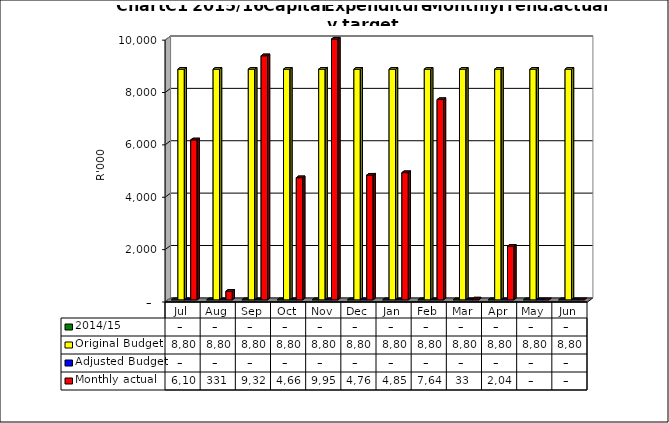
| Category | 2014/15 | Original Budget | Adjusted Budget | Monthly actual |
|---|---|---|---|---|
| Jul | 0 | 8808585.26 | 0 | 6108587 |
| Aug | 0 | 8808585.26 | 0 | 330675 |
| Sep | 0 | 8808585.26 | 0 | 9321519 |
| Oct | 0 | 8808585.26 | 0 | 4663933 |
| Nov | 0 | 8808585.26 | 0 | 9959155 |
| Dec | 0 | 8808585.26 | 0 | 4761825 |
| Jan | 0 | 8808585.26 | 0 | 4858051 |
| Feb | 0 | 8808585.26 | 0 | 7648776 |
| Mar | 0 | 8808585.26 | 0 | 32938 |
| Apr | 0 | 8808585.26 | 0 | 2048835 |
| May | 0 | 8808585.26 | 0 | 0 |
| Jun | 0 | 8808585.26 | 0 | 0 |